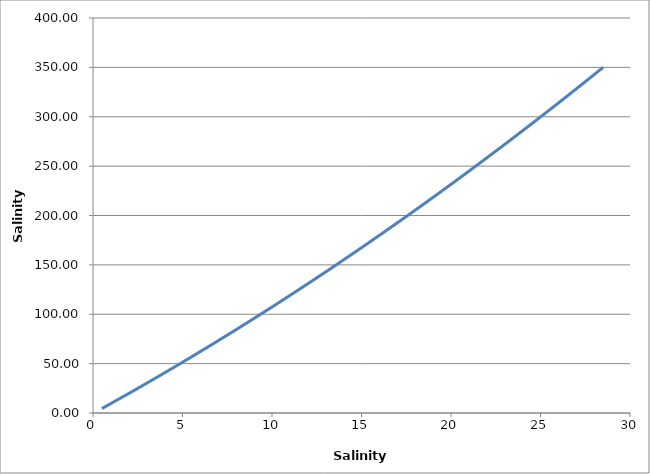
| Category | g/l |
|---|---|
| 0.5 | 4.56 |
| 0.55 | 5.063 |
| 0.6 | 5.566 |
| 0.65 | 6.069 |
| 0.7 | 6.572 |
| 0.75 | 7.076 |
| 0.8 | 7.58 |
| 0.9 | 8.59 |
| 1.0 | 9.602 |
| 1.04 | 10.007 |
| 1.25 | 12.138 |
| 1.5 | 14.685 |
| 1.53 | 14.991 |
| 2.0 | 19.808 |
| 2.2 | 21.869 |
| 2.5 | 24.972 |
| 3.0 | 30.178 |
| 3.5 | 35.424 |
| 4.0 | 40.712 |
| 4.5 | 46.041 |
| 4.9 | 50.333 |
| 5.0 | 51.41 |
| 5.15 | 53.029 |
| 5.5 | 56.82 |
| 5.8 | 60.086 |
| 6.0 | 62.272 |
| 6.5 | 67.765 |
| 6.7 | 69.973 |
| 7.0 | 73.298 |
| 7.5 | 78.872 |
| 7.7 | 81.114 |
| 8.0 | 84.488 |
| 8.5 | 90.145 |
| 9.0 | 95.842 |
| 9.3 | 99.28 |
| 9.4 | 100.43 |
| 9.5 | 101.58 |
| 10.0 | 107.36 |
| 10.2 | 109.683 |
| 10.5 | 113.181 |
| 11.0 | 119.042 |
| 11.46 | 124.471 |
| 11.5 | 124.944 |
| 11.9 | 129.696 |
| 12.0 | 130.888 |
| 12.5 | 136.872 |
| 13.0 | 142.898 |
| 13.5 | 148.965 |
| 13.6 | 150.183 |
| 14.0 | 155.072 |
| 14.5 | 161.221 |
| 15.0 | 167.41 |
| 15.5 | 173.641 |
| 15.6 | 174.892 |
| 16.0 | 179.912 |
| 16.5 | 186.224 |
| 17.0 | 192.578 |
| 17.5 | 198.973 |
| 17.6 | 200.256 |
| 18.0 | 205.408 |
| 18.5 | 211.885 |
| 19.0 | 218.402 |
| 19.5 | 224.961 |
| 19.9 | 230.237 |
| 20.0 | 231.56 |
| 20.1 | 232.885 |
| 20.5 | 238.2 |
| 21.0 | 244.882 |
| 21.5 | 251.605 |
| 22.0 | 258.368 |
| 22.5 | 265.172 |
| 23.0 | 272.018 |
| 23.5 | 278.905 |
| 24.0 | 285.832 |
| 24.5 | 292.8 |
| 25.0 | 299.81 |
| 25.5 | 306.86 |
| 26.0 | 313.952 |
| 26.5 | 321.084 |
| 27.0 | 328.258 |
| 27.5 | 335.472 |
| 28.0 | 342.728 |
| 28.5 | 350.024 |